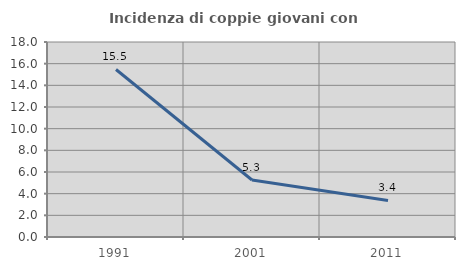
| Category | Incidenza di coppie giovani con figli |
|---|---|
| 1991.0 | 15.464 |
| 2001.0 | 5.263 |
| 2011.0 | 3.371 |